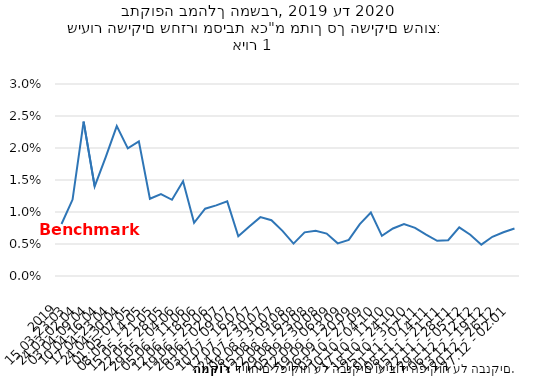
| Category | אכ"מ |
|---|---|
| 2019 | 0.008 |
| 15.03-23.03 | 0.012 |
| 24.03-02.04 | 0.024 |
| 03.04-09.04 | 0.014 |
| 10.04-16.04 | 0.019 |
| 17.04-23.04 | 0.023 |
| 24.04-30.04 | 0.02 |
| 01.05-07.05 | 0.021 |
| 08.05 - 14.05 | 0.012 |
| 15.05 - 21.05 | 0.013 |
| 22.05 - 28.05 | 0.012 |
| 29.05 - 04.06 | 0.015 |
| 05.06 - 11.06 | 0.008 |
| 12.06 - 18.06 | 0.011 |
| 19.06 - 25.06 | 0.011 |
| 26.06 - 02.07 | 0.012 |
| 03.07 - 09.07 | 0.006 |
| 10.07 - 16.07 | 0.008 |
| 17.07 - 23.07 | 0.009 |
| 24.07 - 30.07 | 0.009 |
| 08.08 - 31.07 | 0.007 |
| 15.08 - 09.08 | 0.005 |
| 22.08 - 16.08 | 0.007 |
| 29.08 - 23.08 | 0.007 |
| 05.09 - 30.08 | 0.007 |
| 12.09 - 06.09 | 0.005 |
| 19.09 - 13.09 | 0.006 |
| 26.09 - 20.09 | 0.008 |
| 03.10 - 27.09 | 0.01 |
| 10.10 - 04.10 | 0.006 |
| 17.10 - 11.10 | 0.007 |
| 18.10 - 24.10 | 0.008 |
| 25.10 - 31.10 | 0.008 |
| 01.11 - 07.11 | 0.006 |
| 08.11 - 14.11 | 0.005 |
| 15.11 - 21.11 | 0.006 |
| 22.11 - 28.11 | 0.008 |
| 29.11 - 05.12 | 0.006 |
| 06.12 - 12.12 | 0.005 |
| 13.12 - 19.12 | 0.006 |
| 20.12 - 26.12 | 0.007 |
| 27.12 - 02.01 | 0.007 |